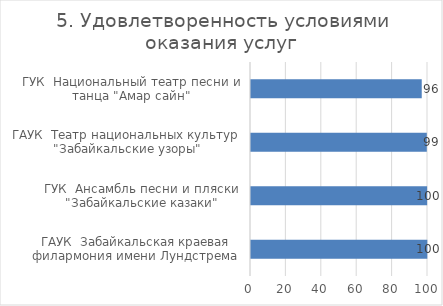
| Category | 5. Удовлетворенность условиями оказания услуг |
|---|---|
| ГАУК  Забайкальская краевая филармония имени Лундстрема  | 99.612 |
| ГУК  Ансамбль песни и пляски  "Забайкальские казаки" | 99.507 |
| ГАУК  Театр национальных культур  "Забайкальские узоры" | 99.323 |
| ГУК  Национальный театр песни и танца "Амар сайн" | 96.461 |